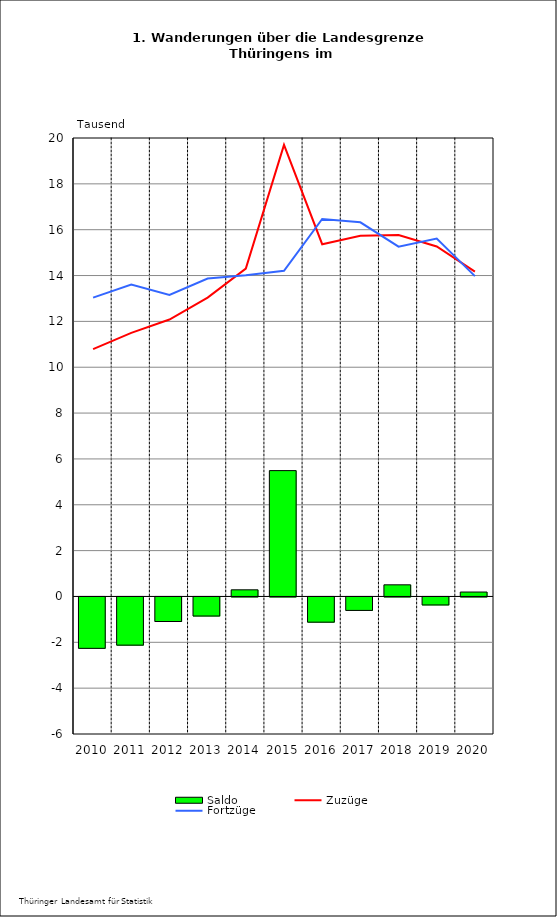
| Category | Saldo |
|---|---|
| 2010.0 | -2.242 |
| 2011.0 | -2.102 |
| 2012.0 | -1.071 |
| 2013.0 | -0.832 |
| 2014.0 | 0.29 |
| 2015.0 | 5.49 |
| 2016.0 | -1.1 |
| 2017.0 | -0.587 |
| 2018.0 | 0.508 |
| 2019.0 | -0.349 |
| 2020.0 | 0.193 |